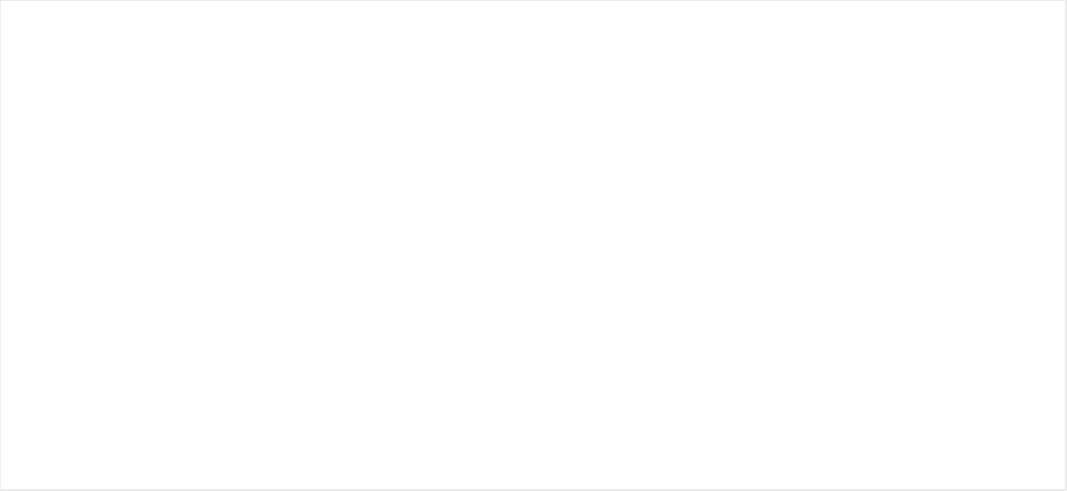
| Category | Series 0 |
|---|---|
| 311 Industria alimentaria | -19.511 |
| 325 Industria química | -17.507 |
| 334 Fabricación de equipo de computación, comunicación, medición y de otros equipos, componentes y accesorios electrónicos | -11.798 |
| 322 Industria del papel | -0.875 |
| 323 Impresión e industrias conexas | -0.003 |
| 314 Fabricación de productos textiles, excepto prendas de vestir | 0 |
| 315 Fabricación de prendas de vestir | 0 |
| 316 Curtido y acabado de cuero y piel, y fabricación de productos de cuero, piel y materiales sucedáneos | 0 |
| 321 Industria de la madera | 0 |
| 324 Fabricación de productos derivados del petróleo y del carbón | 0 |
| 327 Fabricación de productos a base de minerales no metálicos | 0 |
| 337 Fabricación de muebles, colchones y persianas | 0 |
| 331 Industrias metálicas básicas | 0.317 |
| 339 Otras industrias manufactureras | 1.601 |
| 332 Fabricación de productos metálicos | 3.048 |
| 312 Industria de las bebidas y del tabaco | 4.644 |
| 335 Fab. de accesorios, aparatos eléctricos y equipo de generación de energía eléctrica | 5.825 |
| 333 Fabricación de maquinaria y equipo | 8.05 |
| 313 Fab. de insumos textiles y acabado de textiles | 10.474 |
| 323 Industria del plástico y del hule | 18.024 |
| 336 Fab. de eq. de transporte | 179.056 |